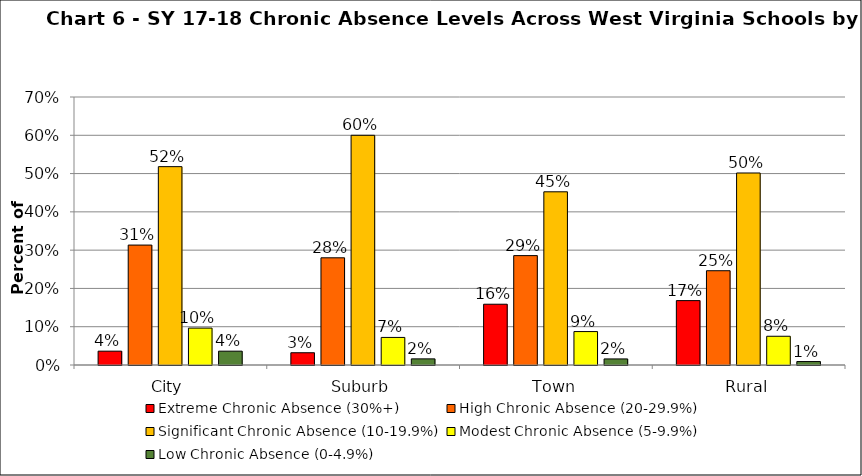
| Category | Extreme Chronic Absence (30%+) | High Chronic Absence (20-29.9%) | Significant Chronic Absence (10-19.9%) | Modest Chronic Absence (5-9.9%) | Low Chronic Absence (0-4.9%) |
|---|---|---|---|---|---|
| 0 | 0.036 | 0.313 | 0.518 | 0.096 | 0.036 |
| 1 | 0.032 | 0.28 | 0.6 | 0.072 | 0.016 |
| 2 | 0.159 | 0.286 | 0.452 | 0.087 | 0.016 |
| 3 | 0.168 | 0.246 | 0.502 | 0.075 | 0.009 |